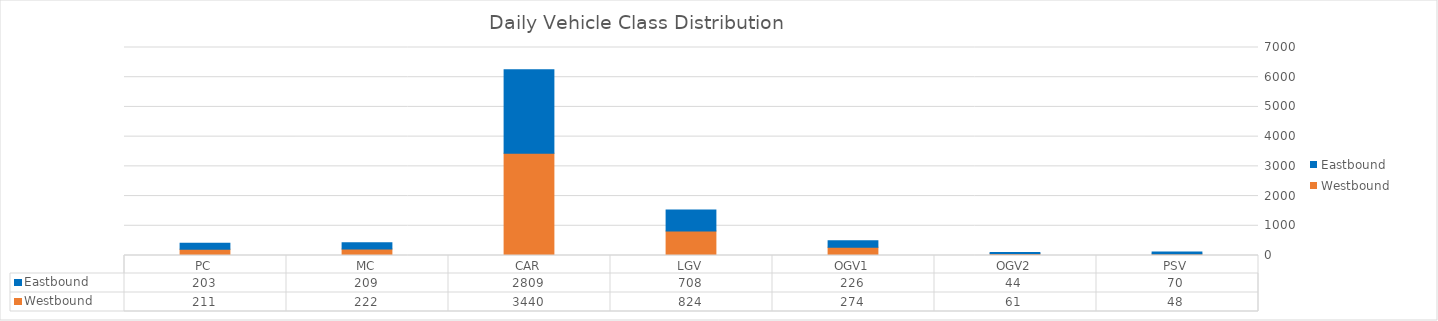
| Category | Westbound | Eastbound |
|---|---|---|
| PC | 211 | 203 |
| MC | 222 | 209 |
| CAR | 3440 | 2809 |
| LGV | 824 | 708 |
| OGV1 | 274 | 226 |
| OGV2 | 61 | 44 |
| PSV | 48 | 70 |